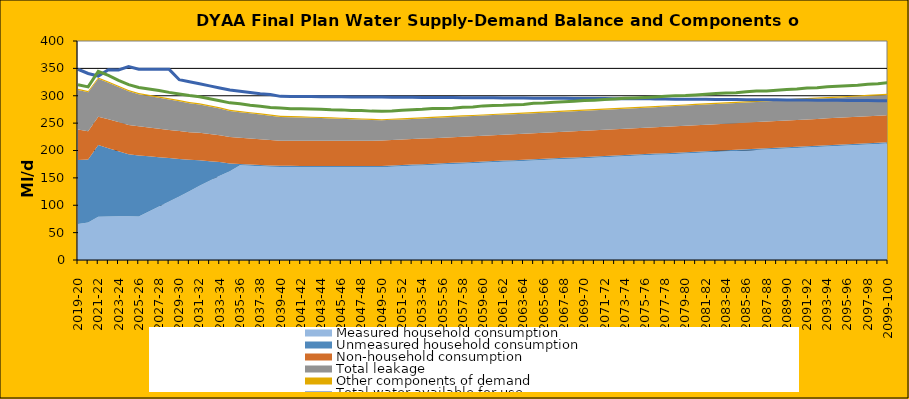
| Category | Total water available for use | Total demand + target headroom (final plan) |
|---|---|---|
| 0 | 348.41 | 320.13 |
| 1 | 340.68 | 316.18 |
| 2 | 335.96 | 344.587 |
| 3 | 347.55 | 337.05 |
| 4 | 347.26 | 328.112 |
| 5 | 353.32 | 320.243 |
| 6 | 348.57 | 315.134 |
| 7 | 348.46 | 312.294 |
| 8 | 348.35 | 309.553 |
| 9 | 348.24 | 306.159 |
| 10 | 329.35 | 303.205 |
| 11 | 325.568 | 300.443 |
| 12 | 321.786 | 298.099 |
| 13 | 318.014 | 294.489 |
| 14 | 314.232 | 290.9 |
| 15 | 310.45 | 287.027 |
| 16 | 308.138 | 285.551 |
| 17 | 305.826 | 282.833 |
| 18 | 303.514 | 280.915 |
| 19 | 302.202 | 278.662 |
| 20 | 298.89 | 277.454 |
| 21 | 298.74 | 276.056 |
| 22 | 298.6 | 276.104 |
| 23 | 298.45 | 275.674 |
| 24 | 298.31 | 275.148 |
| 25 | 298.16 | 274.223 |
| 26 | 298.05 | 274.198 |
| 27 | 297.94 | 273.17 |
| 28 | 297.83 | 272.88 |
| 29 | 297.72 | 271.918 |
| 30 | 297.61 | 271.671 |
| 31 | 297.46 | 272.283 |
| 32 | 297.32 | 273.598 |
| 33 | 297.17 | 274.437 |
| 34 | 297.03 | 275.199 |
| 35 | 296.82 | 276.514 |
| 36 | 296.77 | 276.893 |
| 37 | 296.66 | 277.095 |
| 38 | 296.55 | 279.151 |
| 39 | 296.44 | 279.41 |
| 40 | 296.33 | 281.492 |
| 41 | 296.18 | 282.058 |
| 42 | 296.04 | 282.527 |
| 43 | 295.89 | 283.478 |
| 44 | 295.75 | 284.203 |
| 45 | 295.6 | 286.111 |
| 46 | 295.49 | 286.592 |
| 47 | 295.38 | 288.105 |
| 48 | 295.28 | 288.882 |
| 49 | 295.17 | 289.901 |
| 50 | 295.06 | 291.234 |
| 51 | 294.91 | 291.929 |
| 52 | 294.77 | 292.957 |
| 53 | 294.62 | 294.088 |
| 54 | 294.48 | 295.222 |
| 55 | 294.33 | 295.889 |
| 56 | 295.18 | 296.859 |
| 57 | 294.04 | 297.932 |
| 58 | 293.89 | 298.988 |
| 59 | 293.75 | 300.227 |
| 60 | 293.6 | 300.668 |
| 61 | 293.49 | 301.563 |
| 62 | 293.38 | 302.61 |
| 63 | 293.27 | 303.941 |
| 64 | 293.16 | 304.874 |
| 65 | 293.05 | 305.331 |
| 66 | 292.9 | 307.23 |
| 67 | 292.76 | 308.562 |
| 68 | 292.61 | 308.757 |
| 69 | 292.47 | 310.165 |
| 70 | 292.32 | 311.377 |
| 71 | 292.17 | 312.231 |
| 72 | 292.03 | 314.178 |
| 73 | 291.88 | 314.758 |
| 74 | 291.74 | 316.33 |
| 75 | 291.59 | 317.286 |
| 76 | 291.44 | 318.095 |
| 77 | 291.3 | 319.207 |
| 78 | 291.15 | 321.212 |
| 79 | 291.01 | 322.09 |
| 80 | 290.86 | 323.77 |